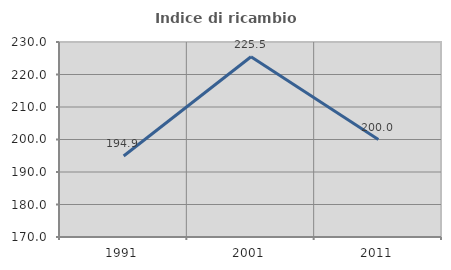
| Category | Indice di ricambio occupazionale  |
|---|---|
| 1991.0 | 194.915 |
| 2001.0 | 225.455 |
| 2011.0 | 200 |